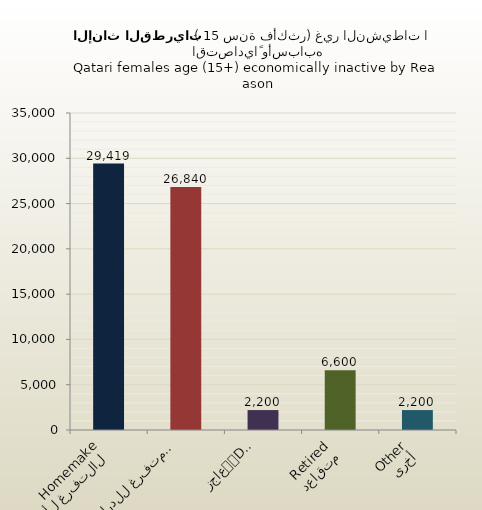
| Category | الاناث القطريات |
|---|---|
| التفرغ لأعمال المنزل
Homemaker | 29419 |
| متفرغ للدراسة
Student | 26840 |
| عاجز
Disabled | 2200 |
| متقاعد
Retired | 6600 |
| أخرى
Other | 2200 |